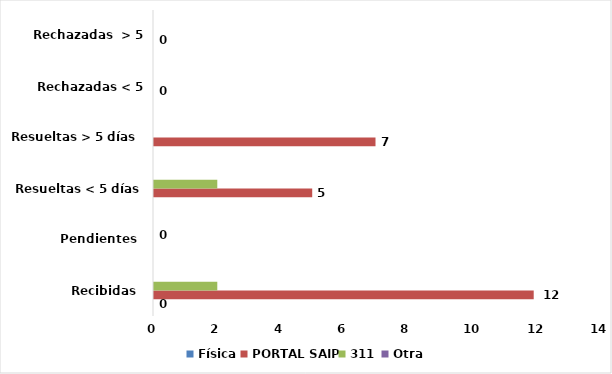
| Category | Física | PORTAL SAIP | 311 | Otra |
|---|---|---|---|---|
| Recibidas  | 0 | 12 | 2 | 0 |
| Pendientes  | 0 | 0 | 0 | 0 |
| Resueltas < 5 días | 0 | 5 | 2 | 0 |
| Resueltas > 5 días  | 0 | 7 | 0 | 0 |
| Rechazadas < 5 días  | 0 | 0 | 0 | 0 |
| Rechazadas  > 5 días | 0 | 0 | 0 | 0 |